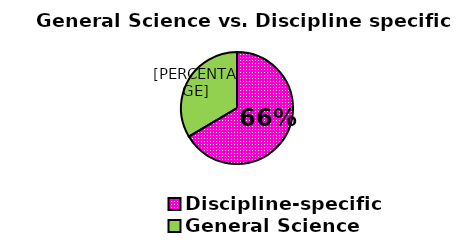
| Category | Series 0 |
|---|---|
| Discipline-specific | 66.492 |
| General Science | 33.508 |